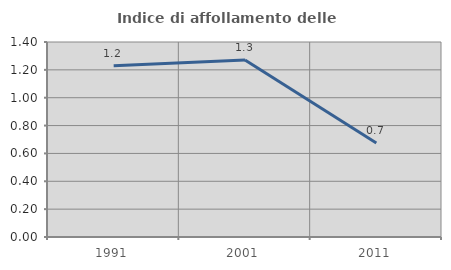
| Category | Indice di affollamento delle abitazioni  |
|---|---|
| 1991.0 | 1.229 |
| 2001.0 | 1.271 |
| 2011.0 | 0.675 |